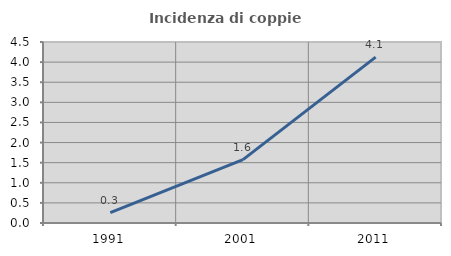
| Category | Incidenza di coppie miste |
|---|---|
| 1991.0 | 0.259 |
| 2001.0 | 1.575 |
| 2011.0 | 4.124 |